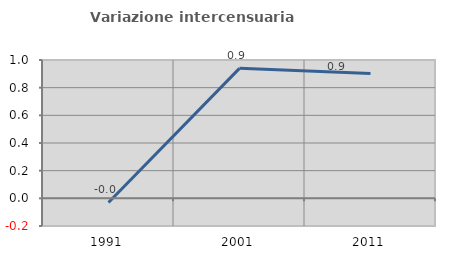
| Category | Variazione intercensuaria annua |
|---|---|
| 1991.0 | -0.03 |
| 2001.0 | 0.94 |
| 2011.0 | 0.903 |